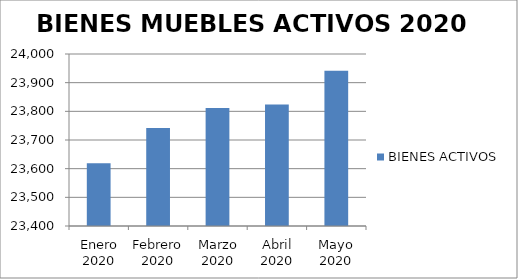
| Category | BIENES ACTIVOS |
|---|---|
| Enero 2020 | 23619 |
| Febrero 2020 | 23742 |
| Marzo 2020 | 23812 |
| Abril 2020 | 23824 |
| Mayo 2020 | 23942 |